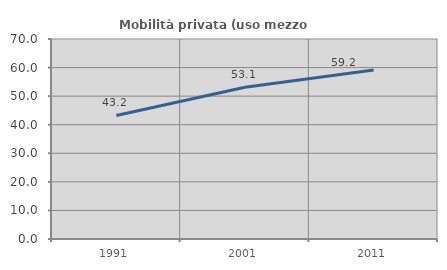
| Category | Mobilità privata (uso mezzo privato) |
|---|---|
| 1991.0 | 43.231 |
| 2001.0 | 53.127 |
| 2011.0 | 59.186 |